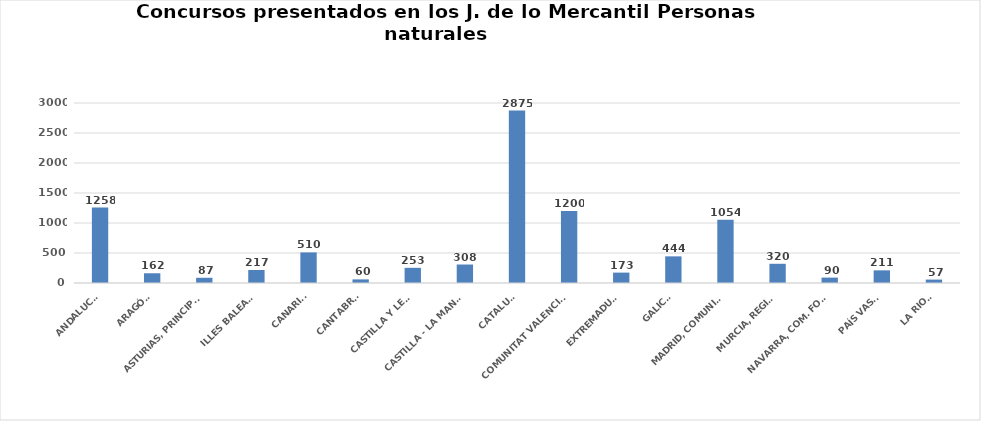
| Category | Series 0 |
|---|---|
| ANDALUCÍA | 1258 |
| ARAGÓN | 162 |
| ASTURIAS, PRINCIPADO | 87 |
| ILLES BALEARS | 217 |
| CANARIAS | 510 |
| CANTABRIA | 60 |
| CASTILLA Y LEÓN | 253 |
| CASTILLA - LA MANCHA | 308 |
| CATALUÑA | 2875 |
| COMUNITAT VALENCIANA | 1200 |
| EXTREMADURA | 173 |
| GALICIA | 444 |
| MADRID, COMUNIDAD | 1054 |
| MURCIA, REGIÓN | 320 |
| NAVARRA, COM. FORAL | 90 |
| PAÍS VASCO | 211 |
| LA RIOJA | 57 |